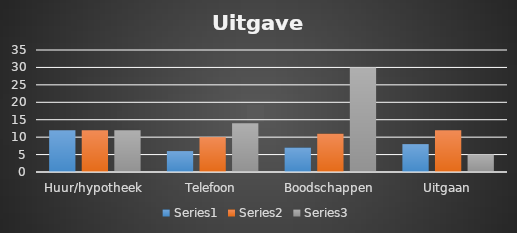
| Category | Series 0 | Series 1 | Series 2 |
|---|---|---|---|
| Huur/hypotheek | 12 | 12 | 12 |
| Telefoon | 6 | 10 | 14 |
| Boodschappen | 7 | 11 | 30 |
| Uitgaan | 8 | 12 | 5 |